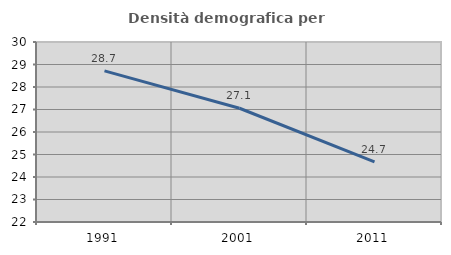
| Category | Densità demografica |
|---|---|
| 1991.0 | 28.714 |
| 2001.0 | 27.056 |
| 2011.0 | 24.672 |